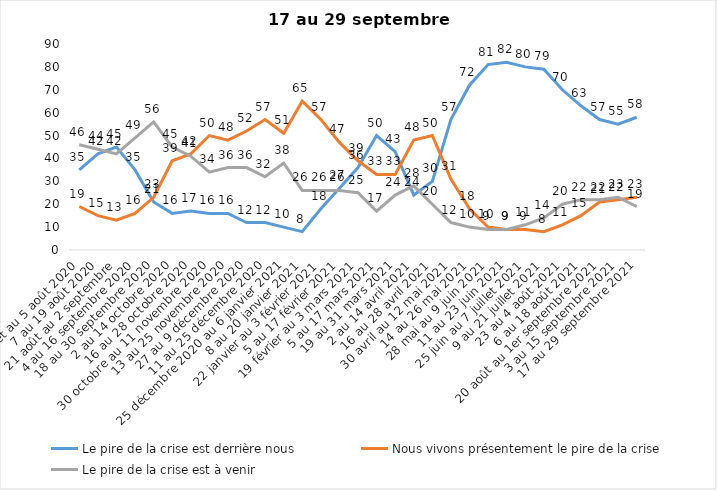
| Category | Le pire de la crise est derrière nous | Nous vivons présentement le pire de la crise | Le pire de la crise est à venir |
|---|---|---|---|
| 24 juillet au 5 août 2020 | 35 | 19 | 46 |
| 7 au 19 août 2020 | 42 | 15 | 44 |
| 21 août au 2 septembre | 45 | 13 | 42 |
| 4 au 16 septembre 2020 | 35 | 16 | 49 |
| 18 au 30 septembre 2020 | 21 | 23 | 56 |
| 2 au 14 octobre 2020 | 16 | 39 | 45 |
| 16 au 28 octobre 2020 | 17 | 42 | 41 |
| 30 octobre au 11 novembre 2020 | 16 | 50 | 34 |
| 13 au 25 novembre 2020 | 16 | 48 | 36 |
| 27 au 9 décembre 2020 | 12 | 52 | 36 |
| 11 au 25 décembre 2020 | 12 | 57 | 32 |
| 25 décembre 2020 au 6 janvier 2021 | 10 | 51 | 38 |
| 8 au 20 janvier 2021 | 8 | 65 | 26 |
| 22 janvier au 3 février 2021 | 18 | 57 | 26 |
| 5 au 17 février 2021 | 27 | 47 | 26 |
| 19 février au 3 mars 2021 | 36 | 39 | 25 |
| 5 au 17 mars 2021 | 50 | 33 | 17 |
| 19 au 31 mars 2021 | 43 | 33 | 24 |
| 2 au 14 avril 2021 | 24 | 48 | 28 |
| 16 au 28 avril 2021 | 30 | 50 | 20 |
| 30 avril au 12 mai 2021 | 57 | 31 | 12 |
| 14 au 26 mai 2021 | 72 | 18 | 10 |
| 28 mai au 9 juin 2021 | 81 | 10 | 9 |
| 11 au 23 juin 2021 | 82 | 9 | 9 |
| 25 juin au 7 juillet 2021 | 80 | 9 | 11 |
| 9 au 21 juillet 2021 | 79 | 8 | 14 |
| 23 au 4 août 2021 | 70 | 11 | 20 |
| 6 au 18 août 2021 | 63 | 15 | 22 |
| 20 août au 1er septembre 2021 | 57 | 21 | 22 |
| 3 au 15 septembre 2021 | 55 | 22 | 23 |
| 17 au 29 septembre 2021 | 58 | 23 | 19 |